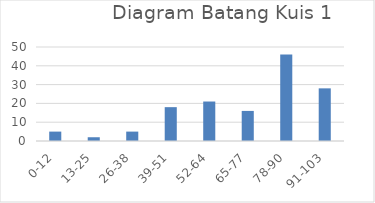
| Category | Series 0 |
|---|---|
| 0-12 | 5 |
| 13-25 | 2 |
| 26-38 | 5 |
| 39-51 | 18 |
| 52-64 | 21 |
| 65-77 | 16 |
| 78-90 | 46 |
| 91-103 | 28 |